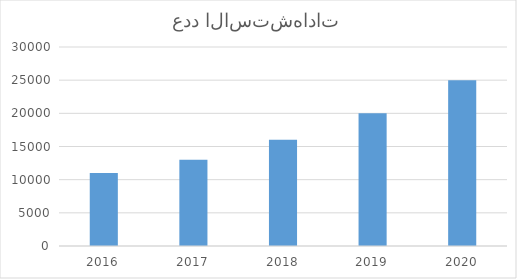
| Category | Series 0 |
|---|---|
| 2016.0 | 11000 |
| 2017.0 | 13000 |
| 2018.0 | 16000 |
| 2019.0 | 20000 |
| 2020.0 | 25000 |